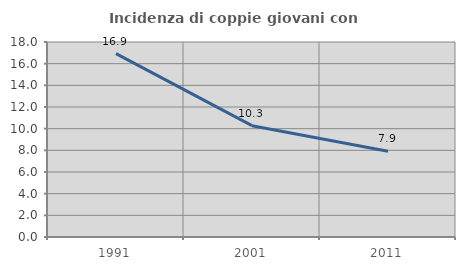
| Category | Incidenza di coppie giovani con figli |
|---|---|
| 1991.0 | 16.933 |
| 2001.0 | 10.276 |
| 2011.0 | 7.912 |